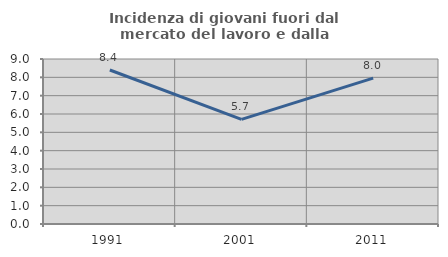
| Category | Incidenza di giovani fuori dal mercato del lavoro e dalla formazione  |
|---|---|
| 1991.0 | 8.399 |
| 2001.0 | 5.709 |
| 2011.0 | 7.955 |